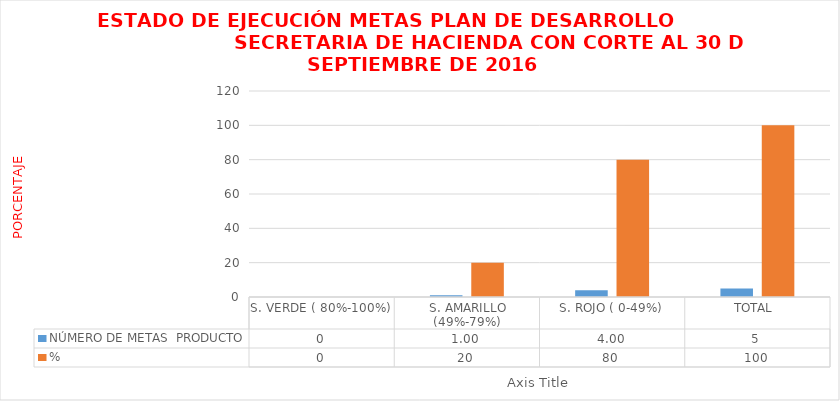
| Category | NÚMERO DE METAS  PRODUCTO  | % |
|---|---|---|
| S. VERDE ( 80%-100%)  | 0 | 0 |
| S. AMARILLO (49%-79%) | 1 | 20 |
| S. ROJO ( 0-49%) | 4 | 80 |
| TOTAL  | 5 | 100 |